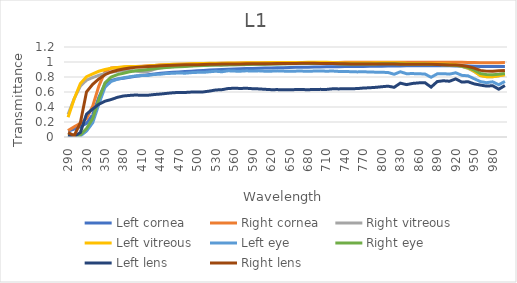
| Category | Left cornea | Right cornea | Right vitreous | Left vitreous | Left eye | Right eye | Left lens | Right lens |
|---|---|---|---|---|---|---|---|---|
| 290.0 | 0.081 | 0.085 | 0.301 | 0.263 | 0.024 | 0.043 | 0.024 | 0.059 |
| 300.0 | 0.106 | 0.137 | 0.512 | 0.509 | 0.008 | 0.015 | 0.008 | 0.019 |
| 310.0 | 0.139 | 0.182 | 0.679 | 0.713 | 0.014 | 0.03 | 0.06 | 0.19 |
| 320.0 | 0.181 | 0.245 | 0.758 | 0.804 | 0.079 | 0.113 | 0.304 | 0.603 |
| 330.0 | 0.3 | 0.411 | 0.793 | 0.843 | 0.19 | 0.245 | 0.373 | 0.703 |
| 340.0 | 0.528 | 0.679 | 0.823 | 0.876 | 0.437 | 0.503 | 0.437 | 0.775 |
| 350.0 | 0.705 | 0.871 | 0.846 | 0.9 | 0.665 | 0.721 | 0.478 | 0.83 |
| 360.0 | 0.755 | 0.919 | 0.864 | 0.915 | 0.741 | 0.8 | 0.5 | 0.867 |
| 370.0 | 0.773 | 0.928 | 0.876 | 0.927 | 0.769 | 0.832 | 0.528 | 0.891 |
| 380.0 | 0.784 | 0.929 | 0.885 | 0.935 | 0.79 | 0.85 | 0.547 | 0.907 |
| 390.0 | 0.798 | 0.936 | 0.885 | 0.94 | 0.803 | 0.869 | 0.555 | 0.92 |
| 400.0 | 0.81 | 0.941 | 0.879 | 0.941 | 0.815 | 0.882 | 0.56 | 0.928 |
| 410.0 | 0.82 | 0.944 | 0.865 | 0.942 | 0.82 | 0.892 | 0.556 | 0.934 |
| 420.0 | 0.829 | 0.949 | 0.874 | 0.946 | 0.82 | 0.9 | 0.557 | 0.94 |
| 430.0 | 0.839 | 0.954 | 0.902 | 0.954 | 0.834 | 0.909 | 0.566 | 0.945 |
| 440.0 | 0.849 | 0.96 | 0.92 | 0.961 | 0.837 | 0.92 | 0.573 | 0.95 |
| 450.0 | 0.856 | 0.964 | 0.931 | 0.965 | 0.847 | 0.927 | 0.581 | 0.954 |
| 460.0 | 0.862 | 0.967 | 0.937 | 0.969 | 0.849 | 0.932 | 0.589 | 0.957 |
| 470.0 | 0.868 | 0.969 | 0.942 | 0.972 | 0.854 | 0.937 | 0.594 | 0.96 |
| 480.0 | 0.873 | 0.971 | 0.946 | 0.974 | 0.851 | 0.942 | 0.594 | 0.962 |
| 490.0 | 0.878 | 0.973 | 0.951 | 0.977 | 0.858 | 0.946 | 0.599 | 0.963 |
| 500.0 | 0.883 | 0.975 | 0.954 | 0.979 | 0.862 | 0.951 | 0.599 | 0.965 |
| 510.0 | 0.888 | 0.977 | 0.956 | 0.981 | 0.862 | 0.954 | 0.601 | 0.967 |
| 520.0 | 0.892 | 0.979 | 0.959 | 0.983 | 0.87 | 0.957 | 0.612 | 0.969 |
| 530.0 | 0.896 | 0.981 | 0.959 | 0.984 | 0.877 | 0.96 | 0.627 | 0.971 |
| 540.0 | 0.9 | 0.983 | 0.958 | 0.985 | 0.869 | 0.961 | 0.631 | 0.974 |
| 550.0 | 0.903 | 0.984 | 0.961 | 0.985 | 0.883 | 0.962 | 0.646 | 0.975 |
| 560.0 | 0.906 | 0.984 | 0.965 | 0.988 | 0.879 | 0.964 | 0.65 | 0.974 |
| 570.0 | 0.909 | 0.986 | 0.965 | 0.988 | 0.877 | 0.965 | 0.647 | 0.975 |
| 580.0 | 0.912 | 0.986 | 0.965 | 0.989 | 0.883 | 0.967 | 0.65 | 0.975 |
| 590.0 | 0.915 | 0.987 | 0.971 | 0.99 | 0.879 | 0.968 | 0.644 | 0.975 |
| 600.0 | 0.917 | 0.988 | 0.974 | 0.991 | 0.882 | 0.97 | 0.641 | 0.976 |
| 610.0 | 0.919 | 0.989 | 0.975 | 0.992 | 0.877 | 0.971 | 0.636 | 0.976 |
| 620.0 | 0.921 | 0.989 | 0.976 | 0.992 | 0.878 | 0.973 | 0.631 | 0.978 |
| 630.0 | 0.924 | 0.99 | 0.978 | 0.993 | 0.882 | 0.975 | 0.632 | 0.979 |
| 640.0 | 0.924 | 0.99 | 0.978 | 0.994 | 0.878 | 0.975 | 0.631 | 0.98 |
| 650.0 | 0.927 | 0.991 | 0.979 | 0.994 | 0.877 | 0.977 | 0.629 | 0.981 |
| 660.0 | 0.929 | 0.992 | 0.98 | 0.995 | 0.878 | 0.979 | 0.632 | 0.981 |
| 670.0 | 0.93 | 0.992 | 0.981 | 0.995 | 0.879 | 0.979 | 0.632 | 0.982 |
| 680.0 | 0.931 | 0.992 | 0.981 | 0.996 | 0.875 | 0.98 | 0.631 | 0.982 |
| 690.0 | 0.934 | 0.993 | 0.982 | 0.996 | 0.879 | 0.981 | 0.633 | 0.982 |
| 700.0 | 0.934 | 0.993 | 0.982 | 0.996 | 0.88 | 0.98 | 0.635 | 0.981 |
| 710.0 | 0.936 | 0.994 | 0.982 | 0.995 | 0.877 | 0.98 | 0.634 | 0.982 |
| 720.0 | 0.937 | 0.994 | 0.981 | 0.993 | 0.88 | 0.979 | 0.643 | 0.98 |
| 730.0 | 0.938 | 0.995 | 0.978 | 0.99 | 0.874 | 0.977 | 0.641 | 0.978 |
| 740.0 | 0.938 | 0.995 | 0.975 | 0.987 | 0.873 | 0.974 | 0.643 | 0.976 |
| 750.0 | 0.939 | 0.995 | 0.975 | 0.987 | 0.871 | 0.973 | 0.644 | 0.975 |
| 760.0 | 0.941 | 0.996 | 0.975 | 0.987 | 0.868 | 0.973 | 0.646 | 0.975 |
| 770.0 | 0.941 | 0.997 | 0.976 | 0.987 | 0.87 | 0.974 | 0.653 | 0.974 |
| 780.0 | 0.942 | 0.997 | 0.977 | 0.988 | 0.866 | 0.974 | 0.657 | 0.974 |
| 790.0 | 0.943 | 0.997 | 0.978 | 0.988 | 0.864 | 0.974 | 0.662 | 0.974 |
| 800.0 | 0.944 | 0.997 | 0.98 | 0.99 | 0.863 | 0.976 | 0.67 | 0.974 |
| 810.0 | 0.945 | 0.997 | 0.981 | 0.991 | 0.86 | 0.976 | 0.678 | 0.974 |
| 820.0 | 0.947 | 0.997 | 0.979 | 0.989 | 0.836 | 0.976 | 0.662 | 0.974 |
| 830.0 | 0.946 | 0.996 | 0.977 | 0.985 | 0.87 | 0.973 | 0.718 | 0.972 |
| 840.0 | 0.949 | 0.996 | 0.974 | 0.982 | 0.844 | 0.971 | 0.698 | 0.971 |
| 850.0 | 0.949 | 0.996 | 0.972 | 0.981 | 0.846 | 0.97 | 0.714 | 0.97 |
| 860.0 | 0.949 | 0.996 | 0.971 | 0.979 | 0.843 | 0.97 | 0.722 | 0.971 |
| 870.0 | 0.95 | 0.996 | 0.97 | 0.978 | 0.84 | 0.969 | 0.724 | 0.97 |
| 880.0 | 0.953 | 0.996 | 0.967 | 0.976 | 0.797 | 0.968 | 0.665 | 0.97 |
| 890.0 | 0.949 | 0.996 | 0.966 | 0.974 | 0.842 | 0.965 | 0.739 | 0.967 |
| 900.0 | 0.949 | 0.996 | 0.964 | 0.972 | 0.845 | 0.962 | 0.75 | 0.964 |
| 910.0 | 0.949 | 0.996 | 0.961 | 0.969 | 0.838 | 0.958 | 0.743 | 0.961 |
| 920.0 | 0.948 | 0.996 | 0.957 | 0.963 | 0.856 | 0.955 | 0.775 | 0.959 |
| 930.0 | 0.949 | 0.996 | 0.94 | 0.946 | 0.822 | 0.944 | 0.732 | 0.953 |
| 940.0 | 0.947 | 0.995 | 0.916 | 0.92 | 0.816 | 0.925 | 0.737 | 0.941 |
| 950.0 | 0.944 | 0.993 | 0.873 | 0.876 | 0.777 | 0.891 | 0.708 | 0.918 |
| 960.0 | 0.939 | 0.99 | 0.819 | 0.82 | 0.74 | 0.847 | 0.693 | 0.888 |
| 970.0 | 0.939 | 0.989 | 0.805 | 0.805 | 0.724 | 0.833 | 0.679 | 0.878 |
| 980.0 | 0.941 | 0.989 | 0.803 | 0.803 | 0.736 | 0.83 | 0.684 | 0.876 |
| 990.0 | 0.939 | 0.991 | 0.815 | 0.815 | 0.697 | 0.837 | 0.637 | 0.882 |
| 1000.0 | 0.941 | 0.992 | 0.831 | 0.831 | 0.741 | 0.847 | 0.686 | 0.888 |